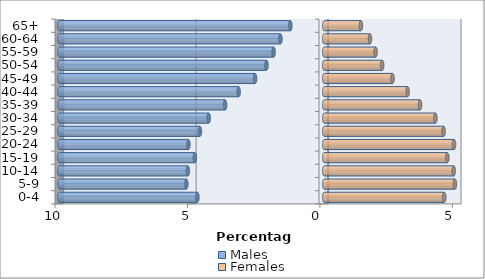
| Category | Males | Females |
|---|---|---|
| 0-4 | -4.787 | 4.533 |
| 5-9 | -5.204 | 4.935 |
| 10-14 | -5.148 | 4.888 |
| 15-19 | -4.884 | 4.646 |
| 20-24 | -5.126 | 4.901 |
| 25-29 | -4.692 | 4.507 |
| 30-34 | -4.359 | 4.198 |
| 35-39 | -3.741 | 3.618 |
| 40-44 | -3.23 | 3.15 |
| 45-49 | -2.61 | 2.578 |
| 50-54 | -2.18 | 2.187 |
| 55-59 | -1.912 | 1.94 |
| 60-64 | -1.653 | 1.729 |
| 65+ | -1.278 | 1.385 |